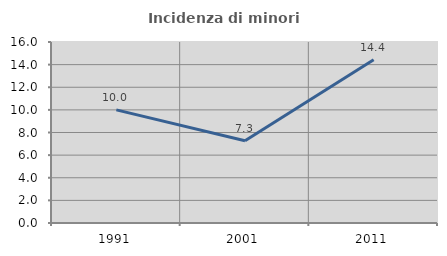
| Category | Incidenza di minori stranieri |
|---|---|
| 1991.0 | 10 |
| 2001.0 | 7.273 |
| 2011.0 | 14.433 |